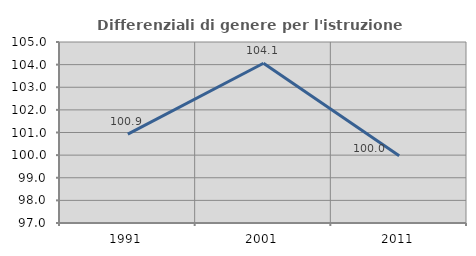
| Category | Differenziali di genere per l'istruzione superiore |
|---|---|
| 1991.0 | 100.925 |
| 2001.0 | 104.061 |
| 2011.0 | 99.977 |